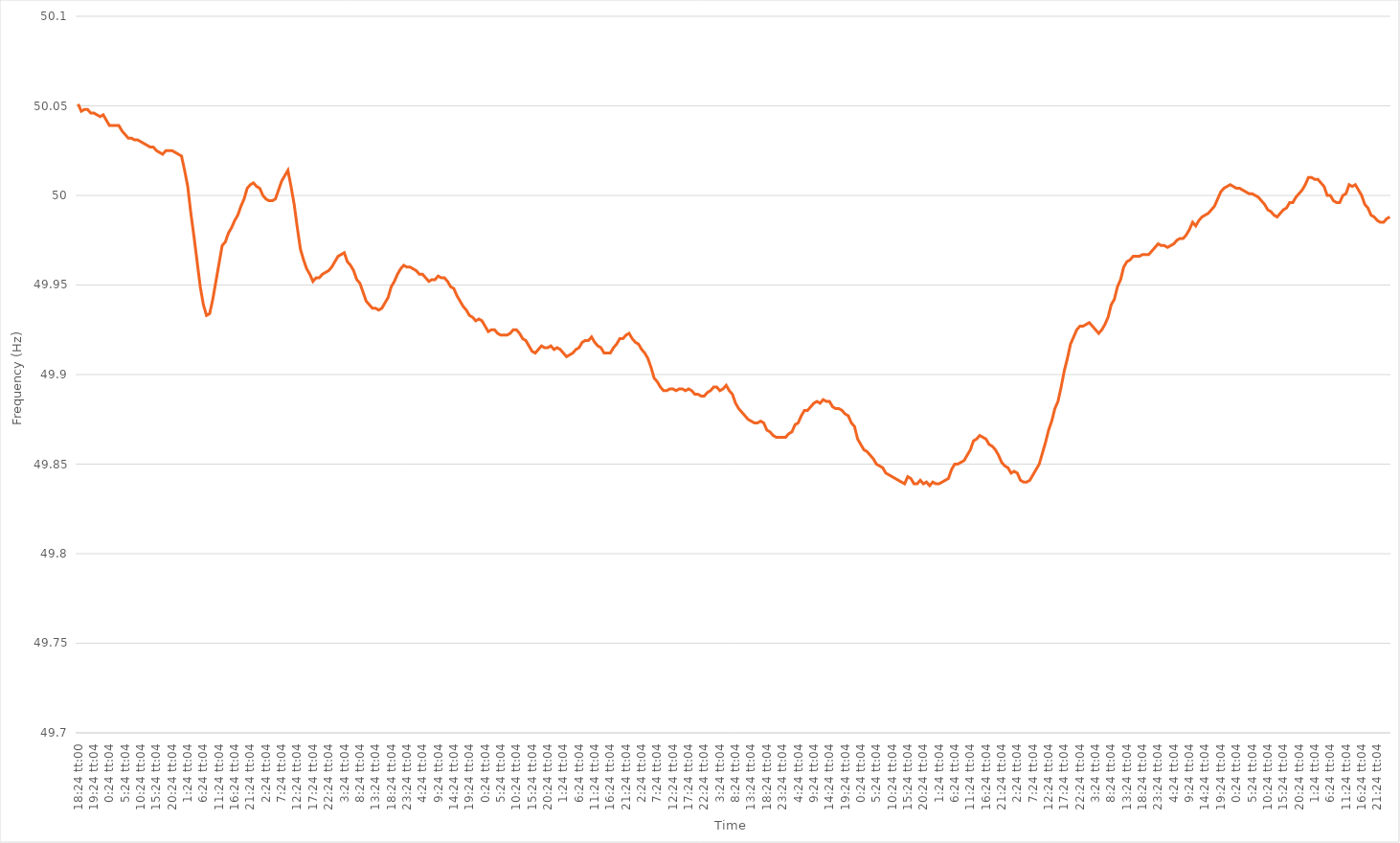
| Category | Series 0 |
|---|---|
| 0.7666666666666666 | 50.051 |
| 0.7666782407407408 | 50.047 |
| 0.7666898148148148 | 50.048 |
| 0.766701388888889 | 50.048 |
| 0.7667129629629629 | 50.046 |
| 0.80837962962963 | 50.046 |
| 0.850046296296296 | 50.045 |
| 0.891712962962963 | 50.044 |
| 0.93337962962963 | 50.045 |
| 0.975046296296296 | 50.042 |
| 1900-01-01 00:24:04 | 50.039 |
| 1900-01-01 01:24:04 | 50.039 |
| 1900-01-01 02:24:04 | 50.039 |
| 1900-01-01 03:24:04 | 50.039 |
| 1900-01-01 04:24:04 | 50.036 |
| 1900-01-01 05:24:04 | 50.034 |
| 1900-01-01 06:24:04 | 50.032 |
| 1900-01-01 07:24:04 | 50.032 |
| 1900-01-01 08:24:04 | 50.031 |
| 1900-01-01 09:24:04 | 50.031 |
| 1900-01-01 10:24:04 | 50.03 |
| 1900-01-01 11:24:04 | 50.029 |
| 1900-01-01 12:24:04 | 50.028 |
| 1900-01-01 13:24:04 | 50.027 |
| 1900-01-01 14:24:04 | 50.027 |
| 1900-01-01 15:24:04 | 50.025 |
| 1900-01-01 16:24:04 | 50.024 |
| 1900-01-01 17:24:04 | 50.023 |
| 1900-01-01 18:24:04 | 50.025 |
| 1900-01-01 19:24:04 | 50.025 |
| 1900-01-01 20:24:04 | 50.025 |
| 1900-01-01 21:24:04 | 50.024 |
| 1900-01-01 22:24:04 | 50.023 |
| 1900-01-01 23:24:04 | 50.022 |
| 1900-01-02 00:24:04 | 50.014 |
| 1900-01-02 01:24:04 | 50.005 |
| 1900-01-02 02:24:04 | 49.99 |
| 1900-01-02 03:24:04 | 49.977 |
| 1900-01-02 04:24:04 | 49.963 |
| 1900-01-02 05:24:04 | 49.949 |
| 1900-01-02 06:24:04 | 49.939 |
| 1900-01-02 07:24:04 | 49.933 |
| 1900-01-02 08:24:04 | 49.934 |
| 1900-01-02 09:24:04 | 49.942 |
| 1900-01-02 10:24:04 | 49.952 |
| 1900-01-02 11:24:04 | 49.962 |
| 1900-01-02 12:24:04 | 49.972 |
| 1900-01-02 13:24:04 | 49.974 |
| 1900-01-02 14:24:04 | 49.979 |
| 1900-01-02 15:24:04 | 49.982 |
| 1900-01-02 16:24:04 | 49.986 |
| 1900-01-02 17:24:04 | 49.989 |
| 1900-01-02 18:24:04 | 49.994 |
| 1900-01-02 19:24:04 | 49.998 |
| 1900-01-02 20:24:04 | 50.004 |
| 1900-01-02 21:24:04 | 50.006 |
| 1900-01-02 22:24:04 | 50.007 |
| 1900-01-02 23:24:04 | 50.005 |
| 1900-01-03 00:24:04 | 50.004 |
| 1900-01-03 01:24:04 | 50 |
| 1900-01-03 02:24:04 | 49.998 |
| 1900-01-03 03:24:04 | 49.997 |
| 1900-01-03 04:24:04 | 49.997 |
| 1900-01-03 05:24:04 | 49.998 |
| 1900-01-03 06:24:04 | 50.003 |
| 1900-01-03 07:24:04 | 50.008 |
| 1900-01-03 08:24:04 | 50.011 |
| 1900-01-03 09:24:04 | 50.014 |
| 1900-01-03 10:24:04 | 50.005 |
| 1900-01-03 11:24:04 | 49.995 |
| 1900-01-03 12:24:04 | 49.982 |
| 1900-01-03 13:24:04 | 49.97 |
| 1900-01-03 14:24:04 | 49.964 |
| 1900-01-03 15:24:04 | 49.959 |
| 1900-01-03 16:24:04 | 49.956 |
| 1900-01-03 17:24:04 | 49.952 |
| 1900-01-03 18:24:04 | 49.954 |
| 1900-01-03 19:24:04 | 49.954 |
| 1900-01-03 20:24:04 | 49.956 |
| 1900-01-03 21:24:04 | 49.957 |
| 1900-01-03 22:24:04 | 49.958 |
| 1900-01-03 23:24:04 | 49.96 |
| 1900-01-04 00:24:04 | 49.963 |
| 1900-01-04 01:24:04 | 49.966 |
| 1900-01-04 02:24:04 | 49.967 |
| 1900-01-04 03:24:04 | 49.968 |
| 1900-01-04 04:24:04 | 49.963 |
| 1900-01-04 05:24:04 | 49.961 |
| 1900-01-04 06:24:04 | 49.958 |
| 1900-01-04 07:24:04 | 49.953 |
| 1900-01-04 08:24:04 | 49.951 |
| 1900-01-04 09:24:04 | 49.946 |
| 1900-01-04 10:24:04 | 49.941 |
| 1900-01-04 11:24:04 | 49.939 |
| 1900-01-04 12:24:04 | 49.937 |
| 1900-01-04 13:24:04 | 49.937 |
| 1900-01-04 14:24:04 | 49.936 |
| 1900-01-04 15:24:04 | 49.937 |
| 1900-01-04 16:24:04 | 49.94 |
| 1900-01-04 17:24:04 | 49.943 |
| 1900-01-04 18:24:04 | 49.949 |
| 1900-01-04 19:24:04 | 49.952 |
| 1900-01-04 20:24:04 | 49.956 |
| 1900-01-04 21:24:04 | 49.959 |
| 1900-01-04 22:24:04 | 49.961 |
| 1900-01-04 23:24:04 | 49.96 |
| 1900-01-05 00:24:04 | 49.96 |
| 1900-01-05 01:24:04 | 49.959 |
| 1900-01-05 02:24:04 | 49.958 |
| 1900-01-05 03:24:04 | 49.956 |
| 1900-01-05 04:24:04 | 49.956 |
| 1900-01-05 05:24:04 | 49.954 |
| 1900-01-05 06:24:04 | 49.952 |
| 1900-01-05 07:24:04 | 49.953 |
| 1900-01-05 08:24:04 | 49.953 |
| 1900-01-05 09:24:04 | 49.955 |
| 1900-01-05 10:24:04 | 49.954 |
| 1900-01-05 11:24:04 | 49.954 |
| 1900-01-05 12:24:04 | 49.952 |
| 1900-01-05 13:24:04 | 49.949 |
| 1900-01-05 14:24:04 | 49.948 |
| 1900-01-05 15:24:04 | 49.944 |
| 1900-01-05 16:24:04 | 49.941 |
| 1900-01-05 17:24:04 | 49.938 |
| 1900-01-05 18:24:04 | 49.936 |
| 1900-01-05 19:24:04 | 49.933 |
| 1900-01-05 20:24:04 | 49.932 |
| 1900-01-05 21:24:04 | 49.93 |
| 1900-01-05 22:24:04 | 49.931 |
| 1900-01-05 23:24:04 | 49.93 |
| 1900-01-06 00:24:04 | 49.927 |
| 1900-01-06 01:24:04 | 49.924 |
| 1900-01-06 02:24:04 | 49.925 |
| 1900-01-06 03:24:04 | 49.925 |
| 1900-01-06 04:24:04 | 49.923 |
| 1900-01-06 05:24:04 | 49.922 |
| 1900-01-06 06:24:04 | 49.922 |
| 1900-01-06 07:24:04 | 49.922 |
| 1900-01-06 08:24:04 | 49.923 |
| 1900-01-06 09:24:04 | 49.925 |
| 1900-01-06 10:24:04 | 49.925 |
| 1900-01-06 11:24:04 | 49.923 |
| 1900-01-06 12:24:04 | 49.92 |
| 1900-01-06 13:24:04 | 49.919 |
| 1900-01-06 14:24:04 | 49.916 |
| 1900-01-06 15:24:04 | 49.913 |
| 1900-01-06 16:24:04 | 49.912 |
| 1900-01-06 17:24:04 | 49.914 |
| 1900-01-06 18:24:04 | 49.916 |
| 1900-01-06 19:24:04 | 49.915 |
| 1900-01-06 20:24:04 | 49.915 |
| 1900-01-06 21:24:04 | 49.916 |
| 1900-01-06 22:24:04 | 49.914 |
| 1900-01-06 23:24:04 | 49.915 |
| 1900-01-07 00:24:04 | 49.914 |
| 1900-01-07 01:24:04 | 49.912 |
| 1900-01-07 02:24:04 | 49.91 |
| 1900-01-07 03:24:04 | 49.911 |
| 1900-01-07 04:24:04 | 49.912 |
| 1900-01-07 05:24:04 | 49.914 |
| 1900-01-07 06:24:04 | 49.915 |
| 1900-01-07 07:24:04 | 49.918 |
| 1900-01-07 08:24:04 | 49.919 |
| 1900-01-07 09:24:04 | 49.919 |
| 1900-01-07 10:24:04 | 49.921 |
| 1900-01-07 11:24:04 | 49.918 |
| 1900-01-07 12:24:04 | 49.916 |
| 1900-01-07 13:24:04 | 49.915 |
| 1900-01-07 14:24:04 | 49.912 |
| 1900-01-07 15:24:04 | 49.912 |
| 1900-01-07 16:24:04 | 49.912 |
| 1900-01-07 17:24:04 | 49.915 |
| 1900-01-07 18:24:04 | 49.917 |
| 1900-01-07 19:24:04 | 49.92 |
| 1900-01-07 20:24:04 | 49.92 |
| 1900-01-07 21:24:04 | 49.922 |
| 1900-01-07 22:24:04 | 49.923 |
| 1900-01-07 23:24:04 | 49.92 |
| 1900-01-08 00:24:04 | 49.918 |
| 1900-01-08 01:24:04 | 49.917 |
| 1900-01-08 02:24:04 | 49.914 |
| 1900-01-08 03:24:04 | 49.912 |
| 1900-01-08 04:24:04 | 49.909 |
| 1900-01-08 05:24:04 | 49.904 |
| 1900-01-08 06:24:04 | 49.898 |
| 1900-01-08 07:24:04 | 49.896 |
| 1900-01-08 08:24:04 | 49.893 |
| 1900-01-08 09:24:04 | 49.891 |
| 1900-01-08 10:24:04 | 49.891 |
| 1900-01-08 11:24:04 | 49.892 |
| 1900-01-08 12:24:04 | 49.892 |
| 1900-01-08 13:24:04 | 49.891 |
| 1900-01-08 14:24:04 | 49.892 |
| 1900-01-08 15:24:04 | 49.892 |
| 1900-01-08 16:24:04 | 49.891 |
| 1900-01-08 17:24:04 | 49.892 |
| 1900-01-08 18:24:04 | 49.891 |
| 1900-01-08 19:24:04 | 49.889 |
| 1900-01-08 20:24:04 | 49.889 |
| 1900-01-08 21:24:04 | 49.888 |
| 1900-01-08 22:24:04 | 49.888 |
| 1900-01-08 23:24:04 | 49.89 |
| 1900-01-09 00:24:04 | 49.891 |
| 1900-01-09 01:24:04 | 49.893 |
| 1900-01-09 02:24:04 | 49.893 |
| 1900-01-09 03:24:04 | 49.891 |
| 1900-01-09 04:24:04 | 49.892 |
| 1900-01-09 05:24:04 | 49.894 |
| 1900-01-09 06:24:04 | 49.891 |
| 1900-01-09 07:24:04 | 49.889 |
| 1900-01-09 08:24:04 | 49.884 |
| 1900-01-09 09:24:04 | 49.881 |
| 1900-01-09 10:24:04 | 49.879 |
| 1900-01-09 11:24:04 | 49.877 |
| 1900-01-09 12:24:04 | 49.875 |
| 1900-01-09 13:24:04 | 49.874 |
| 1900-01-09 14:24:04 | 49.873 |
| 1900-01-09 15:24:04 | 49.873 |
| 1900-01-09 16:24:04 | 49.874 |
| 1900-01-09 17:24:04 | 49.873 |
| 1900-01-09 18:24:04 | 49.869 |
| 1900-01-09 19:24:04 | 49.868 |
| 1900-01-09 20:24:04 | 49.866 |
| 1900-01-09 21:24:04 | 49.865 |
| 1900-01-09 22:24:04 | 49.865 |
| 1900-01-09 23:24:04 | 49.865 |
| 1900-01-10 00:24:04 | 49.865 |
| 1900-01-10 01:24:04 | 49.867 |
| 1900-01-10 02:24:04 | 49.868 |
| 1900-01-10 03:24:04 | 49.872 |
| 1900-01-10 04:24:04 | 49.873 |
| 1900-01-10 05:24:04 | 49.877 |
| 1900-01-10 06:24:04 | 49.88 |
| 1900-01-10 07:24:04 | 49.88 |
| 1900-01-10 08:24:04 | 49.882 |
| 1900-01-10 09:24:04 | 49.884 |
| 1900-01-10 10:24:04 | 49.885 |
| 1900-01-10 11:24:04 | 49.884 |
| 1900-01-10 12:24:04 | 49.886 |
| 1900-01-10 13:24:04 | 49.885 |
| 1900-01-10 14:24:04 | 49.885 |
| 1900-01-10 15:24:04 | 49.882 |
| 1900-01-10 16:24:04 | 49.881 |
| 1900-01-10 17:24:04 | 49.881 |
| 1900-01-10 18:24:04 | 49.88 |
| 1900-01-10 19:24:04 | 49.878 |
| 1900-01-10 20:24:04 | 49.877 |
| 1900-01-10 21:24:04 | 49.873 |
| 1900-01-10 22:24:04 | 49.871 |
| 1900-01-10 23:24:04 | 49.864 |
| 1900-01-11 00:24:04 | 49.861 |
| 1900-01-11 01:24:04 | 49.858 |
| 1900-01-11 02:24:04 | 49.857 |
| 1900-01-11 03:24:04 | 49.855 |
| 1900-01-11 04:24:04 | 49.853 |
| 1900-01-11 05:24:04 | 49.85 |
| 1900-01-11 06:24:04 | 49.849 |
| 1900-01-11 07:24:04 | 49.848 |
| 1900-01-11 08:24:04 | 49.845 |
| 1900-01-11 09:24:04 | 49.844 |
| 1900-01-11 10:24:04 | 49.843 |
| 1900-01-11 11:24:04 | 49.842 |
| 1900-01-11 12:24:04 | 49.841 |
| 1900-01-11 13:24:04 | 49.84 |
| 1900-01-11 14:24:04 | 49.839 |
| 1900-01-11 15:24:04 | 49.843 |
| 1900-01-11 16:24:04 | 49.842 |
| 1900-01-11 17:24:04 | 49.839 |
| 1900-01-11 18:24:04 | 49.839 |
| 1900-01-11 19:24:04 | 49.841 |
| 1900-01-11 20:24:04 | 49.839 |
| 1900-01-11 21:24:04 | 49.84 |
| 1900-01-11 22:24:04 | 49.838 |
| 1900-01-11 23:24:04 | 49.84 |
| 1900-01-12 00:24:04 | 49.839 |
| 1900-01-12 01:24:04 | 49.839 |
| 1900-01-12 02:24:04 | 49.84 |
| 1900-01-12 03:24:04 | 49.841 |
| 1900-01-12 04:24:04 | 49.842 |
| 1900-01-12 05:24:04 | 49.847 |
| 1900-01-12 06:24:04 | 49.85 |
| 1900-01-12 07:24:04 | 49.85 |
| 1900-01-12 08:24:04 | 49.851 |
| 1900-01-12 09:24:04 | 49.852 |
| 1900-01-12 10:24:04 | 49.855 |
| 1900-01-12 11:24:04 | 49.858 |
| 1900-01-12 12:24:04 | 49.863 |
| 1900-01-12 13:24:04 | 49.864 |
| 1900-01-12 14:24:04 | 49.866 |
| 1900-01-12 15:24:04 | 49.865 |
| 1900-01-12 16:24:04 | 49.864 |
| 1900-01-12 17:24:04 | 49.861 |
| 1900-01-12 18:24:04 | 49.86 |
| 1900-01-12 19:24:04 | 49.858 |
| 1900-01-12 20:24:04 | 49.855 |
| 1900-01-12 21:24:04 | 49.851 |
| 1900-01-12 22:24:04 | 49.849 |
| 1900-01-12 23:24:04 | 49.848 |
| 1900-01-13 00:24:04 | 49.845 |
| 1900-01-13 01:24:04 | 49.846 |
| 1900-01-13 02:24:04 | 49.845 |
| 1900-01-13 03:24:04 | 49.841 |
| 1900-01-13 04:24:04 | 49.84 |
| 1900-01-13 05:24:04 | 49.84 |
| 1900-01-13 06:24:04 | 49.841 |
| 1900-01-13 07:24:04 | 49.844 |
| 1900-01-13 08:24:04 | 49.847 |
| 1900-01-13 09:24:04 | 49.85 |
| 1900-01-13 10:24:04 | 49.856 |
| 1900-01-13 11:24:04 | 49.862 |
| 1900-01-13 12:24:04 | 49.869 |
| 1900-01-13 13:24:04 | 49.874 |
| 1900-01-13 14:24:04 | 49.881 |
| 1900-01-13 15:24:04 | 49.885 |
| 1900-01-13 16:24:04 | 49.893 |
| 1900-01-13 17:24:04 | 49.902 |
| 1900-01-13 18:24:04 | 49.909 |
| 1900-01-13 19:24:04 | 49.917 |
| 1900-01-13 20:24:04 | 49.921 |
| 1900-01-13 21:24:04 | 49.925 |
| 1900-01-13 22:24:04 | 49.927 |
| 1900-01-13 23:24:04 | 49.927 |
| 1900-01-14 00:24:04 | 49.928 |
| 1900-01-14 01:24:04 | 49.929 |
| 1900-01-14 02:24:04 | 49.927 |
| 1900-01-14 03:24:04 | 49.925 |
| 1900-01-14 04:24:04 | 49.923 |
| 1900-01-14 05:24:04 | 49.925 |
| 1900-01-14 06:24:04 | 49.928 |
| 1900-01-14 07:24:04 | 49.932 |
| 1900-01-14 08:24:04 | 49.939 |
| 1900-01-14 09:24:04 | 49.942 |
| 1900-01-14 10:24:04 | 49.949 |
| 1900-01-14 11:24:04 | 49.953 |
| 1900-01-14 12:24:04 | 49.96 |
| 1900-01-14 13:24:04 | 49.963 |
| 1900-01-14 14:24:04 | 49.964 |
| 1900-01-14 15:24:04 | 49.966 |
| 1900-01-14 16:24:04 | 49.966 |
| 1900-01-14 17:24:04 | 49.966 |
| 1900-01-14 18:24:04 | 49.967 |
| 1900-01-14 19:24:04 | 49.967 |
| 1900-01-14 20:24:04 | 49.967 |
| 1900-01-14 21:24:04 | 49.969 |
| 1900-01-14 22:24:04 | 49.971 |
| 1900-01-14 23:24:04 | 49.973 |
| 1900-01-15 00:24:04 | 49.972 |
| 1900-01-15 01:24:04 | 49.972 |
| 1900-01-15 02:24:04 | 49.971 |
| 1900-01-15 03:24:04 | 49.972 |
| 1900-01-15 04:24:04 | 49.973 |
| 1900-01-15 05:24:04 | 49.975 |
| 1900-01-15 06:24:04 | 49.976 |
| 1900-01-15 07:24:04 | 49.976 |
| 1900-01-15 08:24:04 | 49.978 |
| 1900-01-15 09:24:04 | 49.981 |
| 1900-01-15 10:24:04 | 49.985 |
| 1900-01-15 11:24:04 | 49.983 |
| 1900-01-15 12:24:04 | 49.986 |
| 1900-01-15 13:24:04 | 49.988 |
| 1900-01-15 14:24:04 | 49.989 |
| 1900-01-15 15:24:04 | 49.99 |
| 1900-01-15 16:24:04 | 49.992 |
| 1900-01-15 17:24:04 | 49.994 |
| 1900-01-15 18:24:04 | 49.998 |
| 1900-01-15 19:24:04 | 50.002 |
| 1900-01-15 20:24:04 | 50.004 |
| 1900-01-15 21:24:04 | 50.005 |
| 1900-01-15 22:24:04 | 50.006 |
| 1900-01-15 23:24:04 | 50.005 |
| 1900-01-16 00:24:04 | 50.004 |
| 1900-01-16 01:24:04 | 50.004 |
| 1900-01-16 02:24:04 | 50.003 |
| 1900-01-16 03:24:04 | 50.002 |
| 1900-01-16 04:24:04 | 50.001 |
| 1900-01-16 05:24:04 | 50.001 |
| 1900-01-16 06:24:04 | 50 |
| 1900-01-16 07:24:04 | 49.999 |
| 1900-01-16 08:24:04 | 49.997 |
| 1900-01-16 09:24:04 | 49.995 |
| 1900-01-16 10:24:04 | 49.992 |
| 1900-01-16 11:24:04 | 49.991 |
| 1900-01-16 12:24:04 | 49.989 |
| 1900-01-16 13:24:04 | 49.988 |
| 1900-01-16 14:24:04 | 49.99 |
| 1900-01-16 15:24:04 | 49.992 |
| 1900-01-16 16:24:04 | 49.993 |
| 1900-01-16 17:24:04 | 49.996 |
| 1900-01-16 18:24:04 | 49.996 |
| 1900-01-16 19:24:04 | 49.999 |
| 1900-01-16 20:24:04 | 50.001 |
| 1900-01-16 21:24:04 | 50.003 |
| 1900-01-16 22:24:04 | 50.006 |
| 1900-01-16 23:24:04 | 50.01 |
| 1900-01-17 00:24:04 | 50.01 |
| 1900-01-17 01:24:04 | 50.009 |
| 1900-01-17 02:24:04 | 50.009 |
| 1900-01-17 03:24:04 | 50.007 |
| 1900-01-17 04:24:04 | 50.005 |
| 1900-01-17 05:24:04 | 50 |
| 1900-01-17 06:24:04 | 50 |
| 1900-01-17 07:24:04 | 49.997 |
| 1900-01-17 08:24:04 | 49.996 |
| 1900-01-17 09:24:04 | 49.996 |
| 1900-01-17 10:24:04 | 50 |
| 1900-01-17 11:24:04 | 50.001 |
| 1900-01-17 12:24:04 | 50.006 |
| 1900-01-17 13:24:04 | 50.005 |
| 1900-01-17 14:24:04 | 50.006 |
| 1900-01-17 15:24:04 | 50.003 |
| 1900-01-17 16:24:04 | 50 |
| 1900-01-17 17:24:04 | 49.995 |
| 1900-01-17 18:24:04 | 49.993 |
| 1900-01-17 19:24:04 | 49.989 |
| 1900-01-17 20:24:04 | 49.988 |
| 1900-01-17 21:24:04 | 49.986 |
| 1900-01-17 22:24:04 | 49.985 |
| 1900-01-17 23:24:04 | 49.985 |
| 1900-01-18 00:24:04 | 49.987 |
| 1900-01-18 01:24:04 | 49.988 |